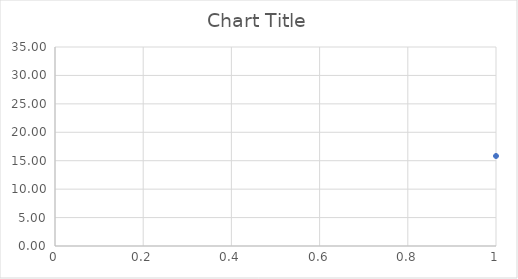
| Category | Series 0 |
|---|---|
| 0 | 15.83 |
| 1 | 23.704 |
| 2 | 27.622 |
| 3 | 29.571 |
| 4 | 30.54 |
| 5 | 31.023 |
| 6 | 31.262 |